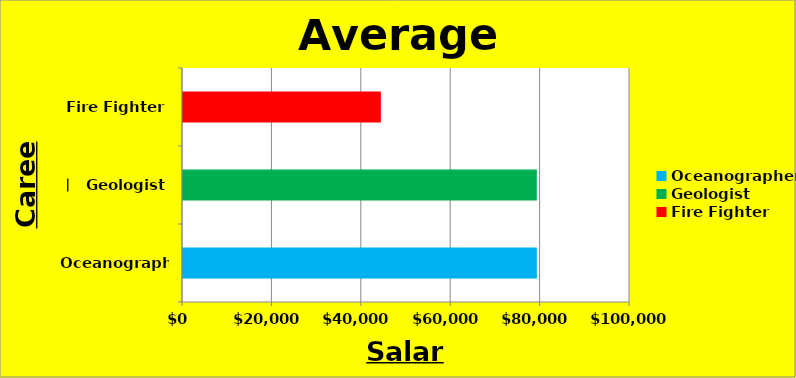
| Category | Average Salary |
|---|---|
| Oceanographer | 79160 |
| Geologist | 79160 |
| Fire Fighter | 44260 |